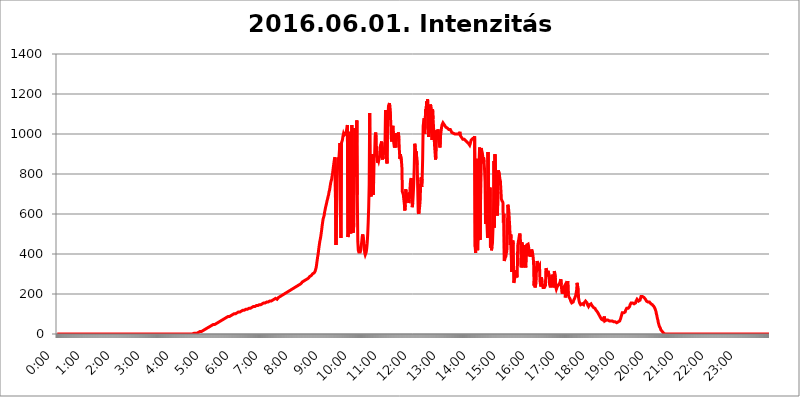
| Category | 2016.06.01. Intenzitás [W/m^2] |
|---|---|
| 0.0 | 0 |
| 0.0006944444444444445 | 0 |
| 0.001388888888888889 | 0 |
| 0.0020833333333333333 | 0 |
| 0.002777777777777778 | 0 |
| 0.003472222222222222 | 0 |
| 0.004166666666666667 | 0 |
| 0.004861111111111111 | 0 |
| 0.005555555555555556 | 0 |
| 0.0062499999999999995 | 0 |
| 0.006944444444444444 | 0 |
| 0.007638888888888889 | 0 |
| 0.008333333333333333 | 0 |
| 0.009027777777777779 | 0 |
| 0.009722222222222222 | 0 |
| 0.010416666666666666 | 0 |
| 0.011111111111111112 | 0 |
| 0.011805555555555555 | 0 |
| 0.012499999999999999 | 0 |
| 0.013194444444444444 | 0 |
| 0.013888888888888888 | 0 |
| 0.014583333333333332 | 0 |
| 0.015277777777777777 | 0 |
| 0.015972222222222224 | 0 |
| 0.016666666666666666 | 0 |
| 0.017361111111111112 | 0 |
| 0.018055555555555557 | 0 |
| 0.01875 | 0 |
| 0.019444444444444445 | 0 |
| 0.02013888888888889 | 0 |
| 0.020833333333333332 | 0 |
| 0.02152777777777778 | 0 |
| 0.022222222222222223 | 0 |
| 0.02291666666666667 | 0 |
| 0.02361111111111111 | 0 |
| 0.024305555555555556 | 0 |
| 0.024999999999999998 | 0 |
| 0.025694444444444447 | 0 |
| 0.02638888888888889 | 0 |
| 0.027083333333333334 | 0 |
| 0.027777777777777776 | 0 |
| 0.02847222222222222 | 0 |
| 0.029166666666666664 | 0 |
| 0.029861111111111113 | 0 |
| 0.030555555555555555 | 0 |
| 0.03125 | 0 |
| 0.03194444444444445 | 0 |
| 0.03263888888888889 | 0 |
| 0.03333333333333333 | 0 |
| 0.034027777777777775 | 0 |
| 0.034722222222222224 | 0 |
| 0.035416666666666666 | 0 |
| 0.036111111111111115 | 0 |
| 0.03680555555555556 | 0 |
| 0.0375 | 0 |
| 0.03819444444444444 | 0 |
| 0.03888888888888889 | 0 |
| 0.03958333333333333 | 0 |
| 0.04027777777777778 | 0 |
| 0.04097222222222222 | 0 |
| 0.041666666666666664 | 0 |
| 0.042361111111111106 | 0 |
| 0.04305555555555556 | 0 |
| 0.043750000000000004 | 0 |
| 0.044444444444444446 | 0 |
| 0.04513888888888889 | 0 |
| 0.04583333333333334 | 0 |
| 0.04652777777777778 | 0 |
| 0.04722222222222222 | 0 |
| 0.04791666666666666 | 0 |
| 0.04861111111111111 | 0 |
| 0.049305555555555554 | 0 |
| 0.049999999999999996 | 0 |
| 0.05069444444444445 | 0 |
| 0.051388888888888894 | 0 |
| 0.052083333333333336 | 0 |
| 0.05277777777777778 | 0 |
| 0.05347222222222222 | 0 |
| 0.05416666666666667 | 0 |
| 0.05486111111111111 | 0 |
| 0.05555555555555555 | 0 |
| 0.05625 | 0 |
| 0.05694444444444444 | 0 |
| 0.057638888888888885 | 0 |
| 0.05833333333333333 | 0 |
| 0.05902777777777778 | 0 |
| 0.059722222222222225 | 0 |
| 0.06041666666666667 | 0 |
| 0.061111111111111116 | 0 |
| 0.06180555555555556 | 0 |
| 0.0625 | 0 |
| 0.06319444444444444 | 0 |
| 0.06388888888888888 | 0 |
| 0.06458333333333334 | 0 |
| 0.06527777777777778 | 0 |
| 0.06597222222222222 | 0 |
| 0.06666666666666667 | 0 |
| 0.06736111111111111 | 0 |
| 0.06805555555555555 | 0 |
| 0.06874999999999999 | 0 |
| 0.06944444444444443 | 0 |
| 0.07013888888888889 | 0 |
| 0.07083333333333333 | 0 |
| 0.07152777777777779 | 0 |
| 0.07222222222222223 | 0 |
| 0.07291666666666667 | 0 |
| 0.07361111111111111 | 0 |
| 0.07430555555555556 | 0 |
| 0.075 | 0 |
| 0.07569444444444444 | 0 |
| 0.0763888888888889 | 0 |
| 0.07708333333333334 | 0 |
| 0.07777777777777778 | 0 |
| 0.07847222222222222 | 0 |
| 0.07916666666666666 | 0 |
| 0.0798611111111111 | 0 |
| 0.08055555555555556 | 0 |
| 0.08125 | 0 |
| 0.08194444444444444 | 0 |
| 0.08263888888888889 | 0 |
| 0.08333333333333333 | 0 |
| 0.08402777777777777 | 0 |
| 0.08472222222222221 | 0 |
| 0.08541666666666665 | 0 |
| 0.08611111111111112 | 0 |
| 0.08680555555555557 | 0 |
| 0.08750000000000001 | 0 |
| 0.08819444444444445 | 0 |
| 0.08888888888888889 | 0 |
| 0.08958333333333333 | 0 |
| 0.09027777777777778 | 0 |
| 0.09097222222222222 | 0 |
| 0.09166666666666667 | 0 |
| 0.09236111111111112 | 0 |
| 0.09305555555555556 | 0 |
| 0.09375 | 0 |
| 0.09444444444444444 | 0 |
| 0.09513888888888888 | 0 |
| 0.09583333333333333 | 0 |
| 0.09652777777777777 | 0 |
| 0.09722222222222222 | 0 |
| 0.09791666666666667 | 0 |
| 0.09861111111111111 | 0 |
| 0.09930555555555555 | 0 |
| 0.09999999999999999 | 0 |
| 0.10069444444444443 | 0 |
| 0.1013888888888889 | 0 |
| 0.10208333333333335 | 0 |
| 0.10277777777777779 | 0 |
| 0.10347222222222223 | 0 |
| 0.10416666666666667 | 0 |
| 0.10486111111111111 | 0 |
| 0.10555555555555556 | 0 |
| 0.10625 | 0 |
| 0.10694444444444444 | 0 |
| 0.1076388888888889 | 0 |
| 0.10833333333333334 | 0 |
| 0.10902777777777778 | 0 |
| 0.10972222222222222 | 0 |
| 0.1111111111111111 | 0 |
| 0.11180555555555556 | 0 |
| 0.11180555555555556 | 0 |
| 0.1125 | 0 |
| 0.11319444444444444 | 0 |
| 0.11388888888888889 | 0 |
| 0.11458333333333333 | 0 |
| 0.11527777777777777 | 0 |
| 0.11597222222222221 | 0 |
| 0.11666666666666665 | 0 |
| 0.1173611111111111 | 0 |
| 0.11805555555555557 | 0 |
| 0.11944444444444445 | 0 |
| 0.12013888888888889 | 0 |
| 0.12083333333333333 | 0 |
| 0.12152777777777778 | 0 |
| 0.12222222222222223 | 0 |
| 0.12291666666666667 | 0 |
| 0.12291666666666667 | 0 |
| 0.12361111111111112 | 0 |
| 0.12430555555555556 | 0 |
| 0.125 | 0 |
| 0.12569444444444444 | 0 |
| 0.12638888888888888 | 0 |
| 0.12708333333333333 | 0 |
| 0.16875 | 0 |
| 0.12847222222222224 | 0 |
| 0.12916666666666668 | 0 |
| 0.12986111111111112 | 0 |
| 0.13055555555555556 | 0 |
| 0.13125 | 0 |
| 0.13194444444444445 | 0 |
| 0.1326388888888889 | 0 |
| 0.13333333333333333 | 0 |
| 0.13402777777777777 | 0 |
| 0.13402777777777777 | 0 |
| 0.13472222222222222 | 0 |
| 0.13541666666666666 | 0 |
| 0.1361111111111111 | 0 |
| 0.13749999999999998 | 0 |
| 0.13819444444444443 | 0 |
| 0.1388888888888889 | 0 |
| 0.13958333333333334 | 0 |
| 0.14027777777777778 | 0 |
| 0.14097222222222222 | 0 |
| 0.14166666666666666 | 0 |
| 0.1423611111111111 | 0 |
| 0.14305555555555557 | 0 |
| 0.14375000000000002 | 0 |
| 0.14444444444444446 | 0 |
| 0.1451388888888889 | 0 |
| 0.1451388888888889 | 0 |
| 0.14652777777777778 | 0 |
| 0.14722222222222223 | 0 |
| 0.14791666666666667 | 0 |
| 0.1486111111111111 | 0 |
| 0.14930555555555555 | 0 |
| 0.15 | 0 |
| 0.15069444444444444 | 0 |
| 0.15138888888888888 | 0 |
| 0.15208333333333332 | 0 |
| 0.15277777777777776 | 0 |
| 0.15347222222222223 | 0 |
| 0.15416666666666667 | 0 |
| 0.15486111111111112 | 0 |
| 0.15555555555555556 | 0 |
| 0.15625 | 0 |
| 0.15694444444444444 | 0 |
| 0.15763888888888888 | 0 |
| 0.15833333333333333 | 0 |
| 0.15902777777777777 | 0 |
| 0.15972222222222224 | 0 |
| 0.16041666666666668 | 0 |
| 0.16111111111111112 | 0 |
| 0.16180555555555556 | 0 |
| 0.1625 | 0 |
| 0.16319444444444445 | 0 |
| 0.1638888888888889 | 0 |
| 0.16458333333333333 | 0 |
| 0.16527777777777777 | 0 |
| 0.16597222222222222 | 0 |
| 0.16666666666666666 | 0 |
| 0.1673611111111111 | 0 |
| 0.16805555555555554 | 0 |
| 0.16874999999999998 | 0 |
| 0.16944444444444443 | 0 |
| 0.17013888888888887 | 0 |
| 0.1708333333333333 | 0 |
| 0.17152777777777775 | 0 |
| 0.17222222222222225 | 0 |
| 0.1729166666666667 | 0 |
| 0.17361111111111113 | 0 |
| 0.17430555555555557 | 0 |
| 0.17500000000000002 | 0 |
| 0.17569444444444446 | 0 |
| 0.1763888888888889 | 0 |
| 0.17708333333333334 | 0 |
| 0.17777777777777778 | 0 |
| 0.17847222222222223 | 0 |
| 0.17916666666666667 | 0 |
| 0.1798611111111111 | 0 |
| 0.18055555555555555 | 0 |
| 0.18125 | 0 |
| 0.18194444444444444 | 0 |
| 0.1826388888888889 | 0 |
| 0.18333333333333335 | 0 |
| 0.1840277777777778 | 0 |
| 0.18472222222222223 | 0 |
| 0.18541666666666667 | 0 |
| 0.18611111111111112 | 0 |
| 0.18680555555555556 | 0 |
| 0.1875 | 0 |
| 0.18819444444444444 | 0 |
| 0.18888888888888888 | 0 |
| 0.18958333333333333 | 0 |
| 0.19027777777777777 | 0 |
| 0.1909722222222222 | 3.525 |
| 0.19166666666666665 | 3.525 |
| 0.19236111111111112 | 3.525 |
| 0.19305555555555554 | 3.525 |
| 0.19375 | 3.525 |
| 0.19444444444444445 | 3.525 |
| 0.1951388888888889 | 3.525 |
| 0.19583333333333333 | 3.525 |
| 0.19652777777777777 | 7.887 |
| 0.19722222222222222 | 7.887 |
| 0.19791666666666666 | 7.887 |
| 0.1986111111111111 | 7.887 |
| 0.19930555555555554 | 12.257 |
| 0.19999999999999998 | 12.257 |
| 0.20069444444444443 | 12.257 |
| 0.20138888888888887 | 12.257 |
| 0.2020833333333333 | 12.257 |
| 0.2027777777777778 | 16.636 |
| 0.2034722222222222 | 16.636 |
| 0.2041666666666667 | 16.636 |
| 0.20486111111111113 | 21.024 |
| 0.20555555555555557 | 21.024 |
| 0.20625000000000002 | 21.024 |
| 0.20694444444444446 | 21.024 |
| 0.2076388888888889 | 21.024 |
| 0.20833333333333334 | 25.419 |
| 0.20902777777777778 | 25.419 |
| 0.20972222222222223 | 29.823 |
| 0.21041666666666667 | 29.823 |
| 0.2111111111111111 | 29.823 |
| 0.21180555555555555 | 29.823 |
| 0.2125 | 34.234 |
| 0.21319444444444444 | 34.234 |
| 0.2138888888888889 | 38.653 |
| 0.21458333333333335 | 38.653 |
| 0.2152777777777778 | 38.653 |
| 0.21597222222222223 | 38.653 |
| 0.21666666666666667 | 43.079 |
| 0.21736111111111112 | 43.079 |
| 0.21805555555555556 | 43.079 |
| 0.21875 | 47.511 |
| 0.21944444444444444 | 47.511 |
| 0.22013888888888888 | 47.511 |
| 0.22083333333333333 | 47.511 |
| 0.22152777777777777 | 47.511 |
| 0.2222222222222222 | 51.951 |
| 0.22291666666666665 | 51.951 |
| 0.2236111111111111 | 51.951 |
| 0.22430555555555556 | 56.398 |
| 0.225 | 56.398 |
| 0.22569444444444445 | 56.398 |
| 0.2263888888888889 | 60.85 |
| 0.22708333333333333 | 60.85 |
| 0.22777777777777777 | 60.85 |
| 0.22847222222222222 | 65.31 |
| 0.22916666666666666 | 65.31 |
| 0.2298611111111111 | 65.31 |
| 0.23055555555555554 | 65.31 |
| 0.23124999999999998 | 69.775 |
| 0.23194444444444443 | 69.775 |
| 0.23263888888888887 | 74.246 |
| 0.2333333333333333 | 74.246 |
| 0.2340277777777778 | 74.246 |
| 0.2347222222222222 | 78.722 |
| 0.2354166666666667 | 78.722 |
| 0.23611111111111113 | 78.722 |
| 0.23680555555555557 | 83.205 |
| 0.23750000000000002 | 83.205 |
| 0.23819444444444446 | 83.205 |
| 0.2388888888888889 | 83.205 |
| 0.23958333333333334 | 87.692 |
| 0.24027777777777778 | 87.692 |
| 0.24097222222222223 | 87.692 |
| 0.24166666666666667 | 87.692 |
| 0.2423611111111111 | 92.184 |
| 0.24305555555555555 | 92.184 |
| 0.24375 | 92.184 |
| 0.24444444444444446 | 92.184 |
| 0.24513888888888888 | 96.682 |
| 0.24583333333333335 | 96.682 |
| 0.2465277777777778 | 96.682 |
| 0.24722222222222223 | 101.184 |
| 0.24791666666666667 | 101.184 |
| 0.24861111111111112 | 101.184 |
| 0.24930555555555556 | 101.184 |
| 0.25 | 101.184 |
| 0.25069444444444444 | 105.69 |
| 0.2513888888888889 | 105.69 |
| 0.2520833333333333 | 105.69 |
| 0.25277777777777777 | 105.69 |
| 0.2534722222222222 | 110.201 |
| 0.25416666666666665 | 110.201 |
| 0.2548611111111111 | 110.201 |
| 0.2555555555555556 | 110.201 |
| 0.25625000000000003 | 110.201 |
| 0.2569444444444445 | 110.201 |
| 0.2576388888888889 | 114.716 |
| 0.25833333333333336 | 114.716 |
| 0.2590277777777778 | 114.716 |
| 0.25972222222222224 | 119.235 |
| 0.2604166666666667 | 119.235 |
| 0.2611111111111111 | 119.235 |
| 0.26180555555555557 | 119.235 |
| 0.2625 | 119.235 |
| 0.26319444444444445 | 123.758 |
| 0.2638888888888889 | 123.758 |
| 0.26458333333333334 | 123.758 |
| 0.2652777777777778 | 123.758 |
| 0.2659722222222222 | 123.758 |
| 0.26666666666666666 | 123.758 |
| 0.2673611111111111 | 128.284 |
| 0.26805555555555555 | 128.284 |
| 0.26875 | 128.284 |
| 0.26944444444444443 | 128.284 |
| 0.2701388888888889 | 128.284 |
| 0.2708333333333333 | 128.284 |
| 0.27152777777777776 | 132.814 |
| 0.2722222222222222 | 132.814 |
| 0.27291666666666664 | 132.814 |
| 0.2736111111111111 | 132.814 |
| 0.2743055555555555 | 132.814 |
| 0.27499999999999997 | 137.347 |
| 0.27569444444444446 | 137.347 |
| 0.27638888888888885 | 137.347 |
| 0.27708333333333335 | 137.347 |
| 0.2777777777777778 | 137.347 |
| 0.27847222222222223 | 141.884 |
| 0.2791666666666667 | 141.884 |
| 0.2798611111111111 | 141.884 |
| 0.28055555555555556 | 141.884 |
| 0.28125 | 141.884 |
| 0.28194444444444444 | 146.423 |
| 0.2826388888888889 | 146.423 |
| 0.2833333333333333 | 146.423 |
| 0.28402777777777777 | 146.423 |
| 0.2847222222222222 | 146.423 |
| 0.28541666666666665 | 146.423 |
| 0.28611111111111115 | 146.423 |
| 0.28680555555555554 | 150.964 |
| 0.28750000000000003 | 150.964 |
| 0.2881944444444445 | 150.964 |
| 0.2888888888888889 | 150.964 |
| 0.28958333333333336 | 155.509 |
| 0.2902777777777778 | 155.509 |
| 0.29097222222222224 | 155.509 |
| 0.2916666666666667 | 155.509 |
| 0.2923611111111111 | 155.509 |
| 0.29305555555555557 | 160.056 |
| 0.29375 | 160.056 |
| 0.29444444444444445 | 160.056 |
| 0.2951388888888889 | 160.056 |
| 0.29583333333333334 | 160.056 |
| 0.2965277777777778 | 164.605 |
| 0.2972222222222222 | 164.605 |
| 0.29791666666666666 | 164.605 |
| 0.2986111111111111 | 164.605 |
| 0.29930555555555555 | 164.605 |
| 0.3 | 164.605 |
| 0.30069444444444443 | 169.156 |
| 0.3013888888888889 | 169.156 |
| 0.3020833333333333 | 169.156 |
| 0.30277777777777776 | 169.156 |
| 0.3034722222222222 | 173.709 |
| 0.30416666666666664 | 173.709 |
| 0.3048611111111111 | 173.709 |
| 0.3055555555555555 | 173.709 |
| 0.30624999999999997 | 178.264 |
| 0.3069444444444444 | 173.709 |
| 0.3076388888888889 | 173.709 |
| 0.30833333333333335 | 173.709 |
| 0.3090277777777778 | 178.264 |
| 0.30972222222222223 | 178.264 |
| 0.3104166666666667 | 182.82 |
| 0.3111111111111111 | 182.82 |
| 0.31180555555555556 | 182.82 |
| 0.3125 | 187.378 |
| 0.31319444444444444 | 187.378 |
| 0.3138888888888889 | 191.937 |
| 0.3145833333333333 | 191.937 |
| 0.31527777777777777 | 191.937 |
| 0.3159722222222222 | 196.497 |
| 0.31666666666666665 | 196.497 |
| 0.31736111111111115 | 196.497 |
| 0.31805555555555554 | 201.058 |
| 0.31875000000000003 | 201.058 |
| 0.3194444444444445 | 201.058 |
| 0.3201388888888889 | 205.62 |
| 0.32083333333333336 | 205.62 |
| 0.3215277777777778 | 205.62 |
| 0.32222222222222224 | 210.182 |
| 0.3229166666666667 | 210.182 |
| 0.3236111111111111 | 214.746 |
| 0.32430555555555557 | 214.746 |
| 0.325 | 214.746 |
| 0.32569444444444445 | 219.309 |
| 0.3263888888888889 | 219.309 |
| 0.32708333333333334 | 219.309 |
| 0.3277777777777778 | 223.873 |
| 0.3284722222222222 | 223.873 |
| 0.32916666666666666 | 223.873 |
| 0.3298611111111111 | 223.873 |
| 0.33055555555555555 | 228.436 |
| 0.33125 | 228.436 |
| 0.33194444444444443 | 233 |
| 0.3326388888888889 | 233 |
| 0.3333333333333333 | 233 |
| 0.3340277777777778 | 233 |
| 0.3347222222222222 | 237.564 |
| 0.3354166666666667 | 237.564 |
| 0.3361111111111111 | 237.564 |
| 0.3368055555555556 | 242.127 |
| 0.33749999999999997 | 242.127 |
| 0.33819444444444446 | 246.689 |
| 0.33888888888888885 | 246.689 |
| 0.33958333333333335 | 246.689 |
| 0.34027777777777773 | 251.251 |
| 0.34097222222222223 | 251.251 |
| 0.3416666666666666 | 251.251 |
| 0.3423611111111111 | 255.813 |
| 0.3430555555555555 | 255.813 |
| 0.34375 | 260.373 |
| 0.3444444444444445 | 260.373 |
| 0.3451388888888889 | 260.373 |
| 0.3458333333333334 | 264.932 |
| 0.34652777777777777 | 264.932 |
| 0.34722222222222227 | 269.49 |
| 0.34791666666666665 | 269.49 |
| 0.34861111111111115 | 269.49 |
| 0.34930555555555554 | 269.49 |
| 0.35000000000000003 | 274.047 |
| 0.3506944444444444 | 274.047 |
| 0.3513888888888889 | 278.603 |
| 0.3520833333333333 | 278.603 |
| 0.3527777777777778 | 283.156 |
| 0.3534722222222222 | 283.156 |
| 0.3541666666666667 | 287.709 |
| 0.3548611111111111 | 287.709 |
| 0.35555555555555557 | 292.259 |
| 0.35625 | 292.259 |
| 0.35694444444444445 | 296.808 |
| 0.3576388888888889 | 296.808 |
| 0.35833333333333334 | 301.354 |
| 0.3590277777777778 | 305.898 |
| 0.3597222222222222 | 305.898 |
| 0.36041666666666666 | 305.898 |
| 0.3611111111111111 | 310.44 |
| 0.36180555555555555 | 314.98 |
| 0.3625 | 324.052 |
| 0.36319444444444443 | 333.113 |
| 0.3638888888888889 | 351.198 |
| 0.3645833333333333 | 369.23 |
| 0.3652777777777778 | 387.202 |
| 0.3659722222222222 | 400.638 |
| 0.3666666666666667 | 422.943 |
| 0.3673611111111111 | 440.702 |
| 0.3680555555555556 | 458.38 |
| 0.36874999999999997 | 471.582 |
| 0.36944444444444446 | 484.735 |
| 0.37013888888888885 | 502.192 |
| 0.37083333333333335 | 519.555 |
| 0.37152777777777773 | 541.121 |
| 0.37222222222222223 | 558.261 |
| 0.3729166666666666 | 575.299 |
| 0.3736111111111111 | 583.779 |
| 0.3743055555555555 | 592.233 |
| 0.375 | 609.062 |
| 0.3756944444444445 | 621.613 |
| 0.3763888888888889 | 634.105 |
| 0.3770833333333334 | 634.105 |
| 0.37777777777777777 | 654.791 |
| 0.37847222222222227 | 667.123 |
| 0.37916666666666665 | 675.311 |
| 0.37986111111111115 | 687.544 |
| 0.38055555555555554 | 695.666 |
| 0.38125000000000003 | 711.832 |
| 0.3819444444444444 | 719.877 |
| 0.3826388888888889 | 735.89 |
| 0.3833333333333333 | 751.803 |
| 0.3840277777777778 | 763.674 |
| 0.3847222222222222 | 771.559 |
| 0.3854166666666667 | 787.258 |
| 0.3861111111111111 | 802.868 |
| 0.38680555555555557 | 822.26 |
| 0.3875 | 841.526 |
| 0.38819444444444445 | 860.676 |
| 0.3888888888888889 | 875.918 |
| 0.38958333333333334 | 883.516 |
| 0.3902777777777778 | 887.309 |
| 0.3909722222222222 | 445.129 |
| 0.39166666666666666 | 600.661 |
| 0.3923611111111111 | 775.492 |
| 0.39305555555555555 | 779.42 |
| 0.39375 | 875.918 |
| 0.39444444444444443 | 879.719 |
| 0.3951388888888889 | 883.516 |
| 0.3958333333333333 | 921.298 |
| 0.3965277777777778 | 955.071 |
| 0.3972222222222222 | 583.779 |
| 0.3979166666666667 | 480.356 |
| 0.3986111111111111 | 955.071 |
| 0.3993055555555556 | 955.071 |
| 0.39999999999999997 | 970.034 |
| 0.40069444444444446 | 988.714 |
| 0.40138888888888885 | 999.916 |
| 0.40208333333333335 | 992.448 |
| 0.40277777777777773 | 992.448 |
| 0.40347222222222223 | 992.448 |
| 0.4041666666666666 | 999.916 |
| 0.4048611111111111 | 1007.383 |
| 0.4055555555555555 | 1014.852 |
| 0.40625 | 1029.798 |
| 0.4069444444444445 | 1044.762 |
| 0.4076388888888889 | 484.735 |
| 0.4083333333333334 | 497.836 |
| 0.40902777777777777 | 541.121 |
| 0.40972222222222227 | 951.327 |
| 0.41041666666666665 | 1011.118 |
| 0.41111111111111115 | 515.223 |
| 0.41180555555555554 | 502.192 |
| 0.41250000000000003 | 613.252 |
| 0.4131944444444444 | 1044.762 |
| 0.4138888888888889 | 646.537 |
| 0.4145833333333333 | 519.555 |
| 0.4152777777777778 | 506.542 |
| 0.4159722222222222 | 553.986 |
| 0.4166666666666667 | 783.342 |
| 0.4173611111111111 | 1029.798 |
| 0.41805555555555557 | 787.258 |
| 0.41875 | 928.819 |
| 0.41944444444444445 | 868.305 |
| 0.4201388888888889 | 1067.267 |
| 0.42083333333333334 | 695.666 |
| 0.4215277777777778 | 462.786 |
| 0.4222222222222222 | 418.492 |
| 0.42291666666666666 | 409.574 |
| 0.4236111111111111 | 409.574 |
| 0.42430555555555555 | 409.574 |
| 0.425 | 409.574 |
| 0.42569444444444443 | 418.492 |
| 0.4263888888888889 | 440.702 |
| 0.4270833333333333 | 462.786 |
| 0.4277777777777778 | 489.108 |
| 0.4284722222222222 | 497.836 |
| 0.4291666666666667 | 502.192 |
| 0.4298611111111111 | 462.786 |
| 0.4305555555555556 | 431.833 |
| 0.43124999999999997 | 405.108 |
| 0.43194444444444446 | 396.164 |
| 0.43263888888888885 | 396.164 |
| 0.43333333333333335 | 409.574 |
| 0.43402777777777773 | 427.39 |
| 0.43472222222222223 | 453.968 |
| 0.4354166666666666 | 497.836 |
| 0.4361111111111111 | 558.261 |
| 0.4368055555555555 | 634.105 |
| 0.4375 | 747.834 |
| 0.4381944444444445 | 1105.019 |
| 0.4388888888888889 | 767.62 |
| 0.4395833333333334 | 695.666 |
| 0.44027777777777777 | 687.544 |
| 0.44097222222222227 | 822.26 |
| 0.44166666666666665 | 779.42 |
| 0.44236111111111115 | 898.668 |
| 0.44305555555555554 | 695.666 |
| 0.44375000000000003 | 759.723 |
| 0.4444444444444444 | 879.719 |
| 0.4451388888888889 | 894.885 |
| 0.4458333333333333 | 988.714 |
| 0.4465277777777778 | 1007.383 |
| 0.4472222222222222 | 981.244 |
| 0.4479166666666667 | 902.447 |
| 0.4486111111111111 | 898.668 |
| 0.44930555555555557 | 856.855 |
| 0.45 | 872.114 |
| 0.45069444444444445 | 864.493 |
| 0.4513888888888889 | 868.305 |
| 0.45208333333333334 | 887.309 |
| 0.4527777777777778 | 932.576 |
| 0.4534722222222222 | 943.832 |
| 0.45416666666666666 | 951.327 |
| 0.4548611111111111 | 962.555 |
| 0.45555555555555555 | 917.534 |
| 0.45625 | 872.114 |
| 0.45694444444444443 | 909.996 |
| 0.4576388888888889 | 898.668 |
| 0.4583333333333333 | 909.996 |
| 0.4590277777777778 | 902.447 |
| 0.4597222222222222 | 958.814 |
| 0.4604166666666667 | 1120.238 |
| 0.4611111111111111 | 875.918 |
| 0.4618055555555556 | 891.099 |
| 0.46249999999999997 | 853.029 |
| 0.46319444444444446 | 1041.019 |
| 0.46388888888888885 | 1089.873 |
| 0.46458333333333335 | 1139.384 |
| 0.46527777777777773 | 1143.232 |
| 0.46597222222222223 | 1154.814 |
| 0.4666666666666666 | 1150.946 |
| 0.4673611111111111 | 1089.873 |
| 0.4680555555555555 | 1026.06 |
| 0.46875 | 962.555 |
| 0.4694444444444445 | 1007.383 |
| 0.4701388888888889 | 1033.537 |
| 0.4708333333333334 | 1041.019 |
| 0.47152777777777777 | 966.295 |
| 0.47222222222222227 | 962.555 |
| 0.47291666666666665 | 932.576 |
| 0.47361111111111115 | 1003.65 |
| 0.47430555555555554 | 947.58 |
| 0.47500000000000003 | 932.576 |
| 0.4756944444444444 | 1003.65 |
| 0.4763888888888889 | 996.182 |
| 0.4770833333333333 | 999.916 |
| 0.4777777777777778 | 981.244 |
| 0.4784722222222222 | 1007.383 |
| 0.4791666666666667 | 973.772 |
| 0.4798611111111111 | 917.534 |
| 0.48055555555555557 | 875.918 |
| 0.48125 | 898.668 |
| 0.48194444444444445 | 902.447 |
| 0.4826388888888889 | 868.305 |
| 0.48333333333333334 | 837.682 |
| 0.4840277777777778 | 711.832 |
| 0.4847222222222222 | 711.832 |
| 0.48541666666666666 | 695.666 |
| 0.4861111111111111 | 671.22 |
| 0.48680555555555555 | 650.667 |
| 0.4875 | 617.436 |
| 0.48819444444444443 | 646.537 |
| 0.4888888888888889 | 723.889 |
| 0.4895833333333333 | 687.544 |
| 0.4902777777777778 | 687.544 |
| 0.4909722222222222 | 683.473 |
| 0.4916666666666667 | 695.666 |
| 0.4923611111111111 | 683.473 |
| 0.4930555555555556 | 654.791 |
| 0.49374999999999997 | 671.22 |
| 0.49444444444444446 | 699.717 |
| 0.49513888888888885 | 751.803 |
| 0.49583333333333335 | 771.559 |
| 0.49652777777777773 | 779.42 |
| 0.49722222222222223 | 699.717 |
| 0.4979166666666666 | 634.105 |
| 0.4986111111111111 | 654.791 |
| 0.4993055555555555 | 699.717 |
| 0.5 | 751.803 |
| 0.5006944444444444 | 833.834 |
| 0.5013888888888889 | 951.327 |
| 0.5020833333333333 | 936.33 |
| 0.5027777777777778 | 906.223 |
| 0.5034722222222222 | 913.766 |
| 0.5041666666666667 | 909.996 |
| 0.5048611111111111 | 845.365 |
| 0.5055555555555555 | 727.896 |
| 0.50625 | 609.062 |
| 0.5069444444444444 | 600.661 |
| 0.5076388888888889 | 613.252 |
| 0.5083333333333333 | 638.256 |
| 0.5090277777777777 | 671.22 |
| 0.5097222222222222 | 759.723 |
| 0.5104166666666666 | 783.342 |
| 0.5111111111111112 | 735.89 |
| 0.5118055555555555 | 775.492 |
| 0.5125000000000001 | 875.918 |
| 0.5131944444444444 | 1041.019 |
| 0.513888888888889 | 1041.019 |
| 0.5145833333333333 | 1078.555 |
| 0.5152777777777778 | 999.916 |
| 0.5159722222222222 | 1059.756 |
| 0.5166666666666667 | 1124.056 |
| 0.517361111111111 | 1112.618 |
| 0.5180555555555556 | 1162.571 |
| 0.5187499999999999 | 1112.618 |
| 0.5194444444444445 | 1174.263 |
| 0.5201388888888888 | 1022.323 |
| 0.5208333333333334 | 984.98 |
| 0.5215277777777778 | 1139.384 |
| 0.5222222222222223 | 1086.097 |
| 0.5229166666666667 | 1037.277 |
| 0.5236111111111111 | 1147.086 |
| 0.5243055555555556 | 1124.056 |
| 0.525 | 1007.383 |
| 0.5256944444444445 | 970.034 |
| 0.5263888888888889 | 1124.056 |
| 0.5270833333333333 | 1074.789 |
| 0.5277777777777778 | 1033.537 |
| 0.5284722222222222 | 992.448 |
| 0.5291666666666667 | 943.832 |
| 0.5298611111111111 | 909.996 |
| 0.5305555555555556 | 872.114 |
| 0.53125 | 887.309 |
| 0.5319444444444444 | 1018.587 |
| 0.5326388888888889 | 999.916 |
| 0.5333333333333333 | 970.034 |
| 0.5340277777777778 | 1022.323 |
| 0.5347222222222222 | 973.772 |
| 0.5354166666666667 | 958.814 |
| 0.5361111111111111 | 947.58 |
| 0.5368055555555555 | 932.576 |
| 0.5375 | 988.714 |
| 0.5381944444444444 | 984.98 |
| 0.5388888888888889 | 1029.798 |
| 0.5395833333333333 | 1044.762 |
| 0.5402777777777777 | 1048.508 |
| 0.5409722222222222 | 1056.004 |
| 0.5416666666666666 | 1056.004 |
| 0.5423611111111112 | 1052.255 |
| 0.5430555555555555 | 1044.762 |
| 0.5437500000000001 | 1044.762 |
| 0.5444444444444444 | 1041.019 |
| 0.545138888888889 | 1033.537 |
| 0.5458333333333333 | 1033.537 |
| 0.5465277777777778 | 1029.798 |
| 0.5472222222222222 | 1029.798 |
| 0.5479166666666667 | 1029.798 |
| 0.548611111111111 | 1026.06 |
| 0.5493055555555556 | 1022.323 |
| 0.5499999999999999 | 1018.587 |
| 0.5506944444444445 | 1022.323 |
| 0.5513888888888888 | 1022.323 |
| 0.5520833333333334 | 1026.06 |
| 0.5527777777777778 | 1018.587 |
| 0.5534722222222223 | 1007.383 |
| 0.5541666666666667 | 1007.383 |
| 0.5548611111111111 | 1007.383 |
| 0.5555555555555556 | 1003.65 |
| 0.55625 | 1003.65 |
| 0.5569444444444445 | 999.916 |
| 0.5576388888888889 | 999.916 |
| 0.5583333333333333 | 999.916 |
| 0.5590277777777778 | 999.916 |
| 0.5597222222222222 | 999.916 |
| 0.5604166666666667 | 999.916 |
| 0.5611111111111111 | 999.916 |
| 0.5618055555555556 | 999.916 |
| 0.5625 | 999.916 |
| 0.5631944444444444 | 999.916 |
| 0.5638888888888889 | 1003.65 |
| 0.5645833333333333 | 1011.118 |
| 0.5652777777777778 | 992.448 |
| 0.5659722222222222 | 992.448 |
| 0.5666666666666667 | 988.714 |
| 0.5673611111111111 | 981.244 |
| 0.5680555555555555 | 977.508 |
| 0.56875 | 973.772 |
| 0.5694444444444444 | 970.034 |
| 0.5701388888888889 | 973.772 |
| 0.5708333333333333 | 973.772 |
| 0.5715277777777777 | 973.772 |
| 0.5722222222222222 | 970.034 |
| 0.5729166666666666 | 966.295 |
| 0.5736111111111112 | 962.555 |
| 0.5743055555555555 | 962.555 |
| 0.5750000000000001 | 958.814 |
| 0.5756944444444444 | 955.071 |
| 0.576388888888889 | 955.071 |
| 0.5770833333333333 | 951.327 |
| 0.5777777777777778 | 947.58 |
| 0.5784722222222222 | 943.832 |
| 0.5791666666666667 | 951.327 |
| 0.579861111111111 | 955.071 |
| 0.5805555555555556 | 970.034 |
| 0.5812499999999999 | 973.772 |
| 0.5819444444444445 | 973.772 |
| 0.5826388888888888 | 977.508 |
| 0.5833333333333334 | 981.244 |
| 0.5840277777777778 | 977.508 |
| 0.5847222222222223 | 981.244 |
| 0.5854166666666667 | 988.714 |
| 0.5861111111111111 | 436.27 |
| 0.5868055555555556 | 405.108 |
| 0.5875 | 856.855 |
| 0.5881944444444445 | 875.918 |
| 0.5888888888888889 | 523.88 |
| 0.5895833333333333 | 418.492 |
| 0.5902777777777778 | 506.542 |
| 0.5909722222222222 | 791.169 |
| 0.5916666666666667 | 868.305 |
| 0.5923611111111111 | 932.576 |
| 0.5930555555555556 | 471.582 |
| 0.59375 | 475.972 |
| 0.5944444444444444 | 928.819 |
| 0.5951388888888889 | 921.298 |
| 0.5958333333333333 | 925.06 |
| 0.5965277777777778 | 898.668 |
| 0.5972222222222222 | 853.029 |
| 0.5979166666666667 | 883.516 |
| 0.5986111111111111 | 860.676 |
| 0.5993055555555555 | 822.26 |
| 0.6 | 763.674 |
| 0.6006944444444444 | 549.704 |
| 0.6013888888888889 | 711.832 |
| 0.6020833333333333 | 583.779 |
| 0.6027777777777777 | 545.416 |
| 0.6034722222222222 | 480.356 |
| 0.6041666666666666 | 909.996 |
| 0.6048611111111112 | 913.766 |
| 0.6055555555555555 | 523.88 |
| 0.6062500000000001 | 484.735 |
| 0.6069444444444444 | 731.896 |
| 0.607638888888889 | 431.833 |
| 0.6083333333333333 | 475.972 |
| 0.6090277777777778 | 418.492 |
| 0.6097222222222222 | 436.27 |
| 0.6104166666666667 | 453.968 |
| 0.611111111111111 | 453.968 |
| 0.6118055555555556 | 596.45 |
| 0.6124999999999999 | 864.493 |
| 0.6131944444444445 | 532.513 |
| 0.6138888888888888 | 898.668 |
| 0.6145833333333334 | 894.885 |
| 0.6152777777777778 | 902.447 |
| 0.6159722222222223 | 695.666 |
| 0.6166666666666667 | 625.784 |
| 0.6173611111111111 | 592.233 |
| 0.6180555555555556 | 711.832 |
| 0.61875 | 818.392 |
| 0.6194444444444445 | 814.519 |
| 0.6201388888888889 | 795.074 |
| 0.6208333333333333 | 775.492 |
| 0.6215277777777778 | 763.674 |
| 0.6222222222222222 | 763.674 |
| 0.6229166666666667 | 675.311 |
| 0.6236111111111111 | 667.123 |
| 0.6243055555555556 | 663.019 |
| 0.625 | 658.909 |
| 0.6256944444444444 | 558.261 |
| 0.6263888888888889 | 600.661 |
| 0.6270833333333333 | 364.728 |
| 0.6277777777777778 | 378.224 |
| 0.6284722222222222 | 378.224 |
| 0.6291666666666667 | 387.202 |
| 0.6298611111111111 | 405.108 |
| 0.6305555555555555 | 414.035 |
| 0.63125 | 480.356 |
| 0.6319444444444444 | 646.537 |
| 0.6326388888888889 | 634.105 |
| 0.6333333333333333 | 617.436 |
| 0.6340277777777777 | 571.049 |
| 0.6347222222222222 | 528.2 |
| 0.6354166666666666 | 445.129 |
| 0.6361111111111112 | 497.836 |
| 0.6368055555555555 | 497.836 |
| 0.6375000000000001 | 310.44 |
| 0.6381944444444444 | 378.224 |
| 0.638888888888889 | 467.187 |
| 0.6395833333333333 | 449.551 |
| 0.6402777777777778 | 255.813 |
| 0.6409722222222222 | 264.932 |
| 0.6416666666666667 | 278.603 |
| 0.642361111111111 | 287.709 |
| 0.6430555555555556 | 287.709 |
| 0.6437499999999999 | 319.517 |
| 0.6444444444444445 | 283.156 |
| 0.6451388888888888 | 296.808 |
| 0.6458333333333334 | 440.702 |
| 0.6465277777777778 | 458.38 |
| 0.6472222222222223 | 471.582 |
| 0.6479166666666667 | 489.108 |
| 0.6486111111111111 | 502.192 |
| 0.6493055555555556 | 489.108 |
| 0.65 | 440.702 |
| 0.6506944444444445 | 333.113 |
| 0.6513888888888889 | 458.38 |
| 0.6520833333333333 | 453.968 |
| 0.6527777777777778 | 440.702 |
| 0.6534722222222222 | 333.113 |
| 0.6541666666666667 | 440.702 |
| 0.6548611111111111 | 431.833 |
| 0.6555555555555556 | 414.035 |
| 0.65625 | 445.129 |
| 0.6569444444444444 | 333.113 |
| 0.6576388888888889 | 333.113 |
| 0.6583333333333333 | 445.129 |
| 0.6590277777777778 | 445.129 |
| 0.6597222222222222 | 449.551 |
| 0.6604166666666667 | 449.551 |
| 0.6611111111111111 | 436.27 |
| 0.6618055555555555 | 391.685 |
| 0.6625 | 405.108 |
| 0.6631944444444444 | 387.202 |
| 0.6638888888888889 | 387.202 |
| 0.6645833333333333 | 400.638 |
| 0.6652777777777777 | 422.943 |
| 0.6659722222222222 | 422.943 |
| 0.6666666666666666 | 405.108 |
| 0.6673611111111111 | 387.202 |
| 0.6680555555555556 | 360.221 |
| 0.6687500000000001 | 242.127 |
| 0.6694444444444444 | 278.603 |
| 0.6701388888888888 | 233 |
| 0.6708333333333334 | 242.127 |
| 0.6715277777777778 | 255.813 |
| 0.6722222222222222 | 333.113 |
| 0.6729166666666666 | 364.728 |
| 0.6736111111111112 | 355.712 |
| 0.6743055555555556 | 342.162 |
| 0.6749999999999999 | 333.113 |
| 0.6756944444444444 | 333.113 |
| 0.6763888888888889 | 342.162 |
| 0.6770833333333334 | 264.932 |
| 0.6777777777777777 | 246.689 |
| 0.6784722222222223 | 237.564 |
| 0.6791666666666667 | 283.156 |
| 0.6798611111111111 | 260.373 |
| 0.6805555555555555 | 264.932 |
| 0.68125 | 233 |
| 0.6819444444444445 | 233 |
| 0.6826388888888889 | 233 |
| 0.6833333333333332 | 233 |
| 0.6840277777777778 | 237.564 |
| 0.6847222222222222 | 242.127 |
| 0.6854166666666667 | 328.584 |
| 0.686111111111111 | 333.113 |
| 0.6868055555555556 | 314.98 |
| 0.6875 | 287.709 |
| 0.6881944444444444 | 314.98 |
| 0.688888888888889 | 319.517 |
| 0.6895833333333333 | 296.808 |
| 0.6902777777777778 | 251.251 |
| 0.6909722222222222 | 242.127 |
| 0.6916666666666668 | 233 |
| 0.6923611111111111 | 233 |
| 0.6930555555555555 | 278.603 |
| 0.69375 | 296.808 |
| 0.6944444444444445 | 287.709 |
| 0.6951388888888889 | 292.259 |
| 0.6958333333333333 | 233 |
| 0.6965277777777777 | 274.047 |
| 0.6972222222222223 | 314.98 |
| 0.6979166666666666 | 310.44 |
| 0.6986111111111111 | 283.156 |
| 0.6993055555555556 | 233 |
| 0.7000000000000001 | 223.873 |
| 0.7006944444444444 | 228.436 |
| 0.7013888888888888 | 237.564 |
| 0.7020833333333334 | 242.127 |
| 0.7027777777777778 | 242.127 |
| 0.7034722222222222 | 246.689 |
| 0.7041666666666666 | 251.251 |
| 0.7048611111111112 | 255.813 |
| 0.7055555555555556 | 251.251 |
| 0.7062499999999999 | 274.047 |
| 0.7069444444444444 | 246.689 |
| 0.7076388888888889 | 214.746 |
| 0.7083333333333334 | 201.058 |
| 0.7090277777777777 | 196.497 |
| 0.7097222222222223 | 196.497 |
| 0.7104166666666667 | 233 |
| 0.7111111111111111 | 237.564 |
| 0.7118055555555555 | 242.127 |
| 0.7125 | 182.82 |
| 0.7131944444444445 | 196.497 |
| 0.7138888888888889 | 233 |
| 0.7145833333333332 | 210.182 |
| 0.7152777777777778 | 242.127 |
| 0.7159722222222222 | 264.932 |
| 0.7166666666666667 | 201.058 |
| 0.717361111111111 | 187.378 |
| 0.7180555555555556 | 182.82 |
| 0.71875 | 182.82 |
| 0.7194444444444444 | 173.709 |
| 0.720138888888889 | 164.605 |
| 0.7208333333333333 | 160.056 |
| 0.7215277777777778 | 155.509 |
| 0.7222222222222222 | 155.509 |
| 0.7229166666666668 | 155.509 |
| 0.7236111111111111 | 160.056 |
| 0.7243055555555555 | 169.156 |
| 0.725 | 173.709 |
| 0.7256944444444445 | 178.264 |
| 0.7263888888888889 | 182.82 |
| 0.7270833333333333 | 191.937 |
| 0.7277777777777777 | 205.62 |
| 0.7284722222222223 | 219.309 |
| 0.7291666666666666 | 255.813 |
| 0.7298611111111111 | 251.251 |
| 0.7305555555555556 | 219.309 |
| 0.7312500000000001 | 178.264 |
| 0.7319444444444444 | 164.605 |
| 0.7326388888888888 | 155.509 |
| 0.7333333333333334 | 150.964 |
| 0.7340277777777778 | 146.423 |
| 0.7347222222222222 | 146.423 |
| 0.7354166666666666 | 146.423 |
| 0.7361111111111112 | 150.964 |
| 0.7368055555555556 | 146.423 |
| 0.7374999999999999 | 146.423 |
| 0.7381944444444444 | 146.423 |
| 0.7388888888888889 | 155.509 |
| 0.7395833333333334 | 160.056 |
| 0.7402777777777777 | 160.056 |
| 0.7409722222222223 | 164.605 |
| 0.7416666666666667 | 164.605 |
| 0.7423611111111111 | 160.056 |
| 0.7430555555555555 | 155.509 |
| 0.74375 | 146.423 |
| 0.7444444444444445 | 141.884 |
| 0.7451388888888889 | 137.347 |
| 0.7458333333333332 | 141.884 |
| 0.7465277777777778 | 146.423 |
| 0.7472222222222222 | 146.423 |
| 0.7479166666666667 | 150.964 |
| 0.748611111111111 | 150.964 |
| 0.7493055555555556 | 146.423 |
| 0.75 | 141.884 |
| 0.7506944444444444 | 137.347 |
| 0.751388888888889 | 137.347 |
| 0.7520833333333333 | 132.814 |
| 0.7527777777777778 | 132.814 |
| 0.7534722222222222 | 128.284 |
| 0.7541666666666668 | 128.284 |
| 0.7548611111111111 | 123.758 |
| 0.7555555555555555 | 119.235 |
| 0.75625 | 119.235 |
| 0.7569444444444445 | 114.716 |
| 0.7576388888888889 | 110.201 |
| 0.7583333333333333 | 110.201 |
| 0.7590277777777777 | 101.184 |
| 0.7597222222222223 | 96.682 |
| 0.7604166666666666 | 92.184 |
| 0.7611111111111111 | 87.692 |
| 0.7618055555555556 | 83.205 |
| 0.7625000000000001 | 78.722 |
| 0.7631944444444444 | 74.246 |
| 0.7638888888888888 | 74.246 |
| 0.7645833333333334 | 69.775 |
| 0.7652777777777778 | 69.775 |
| 0.7659722222222222 | 69.775 |
| 0.7666666666666666 | 69.775 |
| 0.7673611111111112 | 87.692 |
| 0.7680555555555556 | 65.31 |
| 0.7687499999999999 | 65.31 |
| 0.7694444444444444 | 65.31 |
| 0.7701388888888889 | 69.775 |
| 0.7708333333333334 | 69.775 |
| 0.7715277777777777 | 69.775 |
| 0.7722222222222223 | 69.775 |
| 0.7729166666666667 | 69.775 |
| 0.7736111111111111 | 69.775 |
| 0.7743055555555555 | 65.31 |
| 0.775 | 65.31 |
| 0.7756944444444445 | 65.31 |
| 0.7763888888888889 | 65.31 |
| 0.7770833333333332 | 65.31 |
| 0.7777777777777778 | 65.31 |
| 0.7784722222222222 | 65.31 |
| 0.7791666666666667 | 65.31 |
| 0.779861111111111 | 65.31 |
| 0.7805555555555556 | 60.85 |
| 0.78125 | 60.85 |
| 0.7819444444444444 | 60.85 |
| 0.782638888888889 | 60.85 |
| 0.7833333333333333 | 56.398 |
| 0.7840277777777778 | 56.398 |
| 0.7847222222222222 | 56.398 |
| 0.7854166666666668 | 56.398 |
| 0.7861111111111111 | 56.398 |
| 0.7868055555555555 | 60.85 |
| 0.7875 | 60.85 |
| 0.7881944444444445 | 65.31 |
| 0.7888888888888889 | 65.31 |
| 0.7895833333333333 | 69.775 |
| 0.7902777777777777 | 78.722 |
| 0.7909722222222223 | 87.692 |
| 0.7916666666666666 | 96.682 |
| 0.7923611111111111 | 105.69 |
| 0.7930555555555556 | 110.201 |
| 0.7937500000000001 | 110.201 |
| 0.7944444444444444 | 105.69 |
| 0.7951388888888888 | 101.184 |
| 0.7958333333333334 | 101.184 |
| 0.7965277777777778 | 110.201 |
| 0.7972222222222222 | 119.235 |
| 0.7979166666666666 | 123.758 |
| 0.7986111111111112 | 128.284 |
| 0.7993055555555556 | 128.284 |
| 0.7999999999999999 | 128.284 |
| 0.8006944444444444 | 128.284 |
| 0.8013888888888889 | 128.284 |
| 0.8020833333333334 | 132.814 |
| 0.8027777777777777 | 137.347 |
| 0.8034722222222223 | 146.423 |
| 0.8041666666666667 | 150.964 |
| 0.8048611111111111 | 155.509 |
| 0.8055555555555555 | 155.509 |
| 0.80625 | 155.509 |
| 0.8069444444444445 | 155.509 |
| 0.8076388888888889 | 155.509 |
| 0.8083333333333332 | 150.964 |
| 0.8090277777777778 | 150.964 |
| 0.8097222222222222 | 150.964 |
| 0.8104166666666667 | 150.964 |
| 0.811111111111111 | 155.509 |
| 0.8118055555555556 | 164.605 |
| 0.8125 | 169.156 |
| 0.8131944444444444 | 173.709 |
| 0.813888888888889 | 173.709 |
| 0.8145833333333333 | 173.709 |
| 0.8152777777777778 | 164.605 |
| 0.8159722222222222 | 164.605 |
| 0.8166666666666668 | 164.605 |
| 0.8173611111111111 | 169.156 |
| 0.8180555555555555 | 178.264 |
| 0.81875 | 187.378 |
| 0.8194444444444445 | 191.937 |
| 0.8201388888888889 | 191.937 |
| 0.8208333333333333 | 187.378 |
| 0.8215277777777777 | 187.378 |
| 0.8222222222222223 | 182.82 |
| 0.8229166666666666 | 182.82 |
| 0.8236111111111111 | 182.82 |
| 0.8243055555555556 | 178.264 |
| 0.8250000000000001 | 173.709 |
| 0.8256944444444444 | 169.156 |
| 0.8263888888888888 | 164.605 |
| 0.8270833333333334 | 164.605 |
| 0.8277777777777778 | 160.056 |
| 0.8284722222222222 | 160.056 |
| 0.8291666666666666 | 160.056 |
| 0.8298611111111112 | 160.056 |
| 0.8305555555555556 | 160.056 |
| 0.8312499999999999 | 160.056 |
| 0.8319444444444444 | 155.509 |
| 0.8326388888888889 | 150.964 |
| 0.8333333333333334 | 150.964 |
| 0.8340277777777777 | 146.423 |
| 0.8347222222222223 | 146.423 |
| 0.8354166666666667 | 146.423 |
| 0.8361111111111111 | 141.884 |
| 0.8368055555555555 | 137.347 |
| 0.8375 | 132.814 |
| 0.8381944444444445 | 128.284 |
| 0.8388888888888889 | 123.758 |
| 0.8395833333333332 | 114.716 |
| 0.8402777777777778 | 101.184 |
| 0.8409722222222222 | 92.184 |
| 0.8416666666666667 | 78.722 |
| 0.842361111111111 | 69.775 |
| 0.8430555555555556 | 56.398 |
| 0.84375 | 47.511 |
| 0.8444444444444444 | 38.653 |
| 0.845138888888889 | 34.234 |
| 0.8458333333333333 | 29.823 |
| 0.8465277777777778 | 21.024 |
| 0.8472222222222222 | 16.636 |
| 0.8479166666666668 | 16.636 |
| 0.8486111111111111 | 12.257 |
| 0.8493055555555555 | 7.887 |
| 0.85 | 7.887 |
| 0.8506944444444445 | 3.525 |
| 0.8513888888888889 | 0 |
| 0.8520833333333333 | 0 |
| 0.8527777777777777 | 0 |
| 0.8534722222222223 | 0 |
| 0.8541666666666666 | 0 |
| 0.8548611111111111 | 0 |
| 0.8555555555555556 | 0 |
| 0.8562500000000001 | 0 |
| 0.8569444444444444 | 0 |
| 0.8576388888888888 | 0 |
| 0.8583333333333334 | 0 |
| 0.8590277777777778 | 0 |
| 0.8597222222222222 | 0 |
| 0.8604166666666666 | 0 |
| 0.8611111111111112 | 0 |
| 0.8618055555555556 | 0 |
| 0.8624999999999999 | 0 |
| 0.8631944444444444 | 0 |
| 0.8638888888888889 | 0 |
| 0.8645833333333334 | 0 |
| 0.8652777777777777 | 0 |
| 0.8659722222222223 | 0 |
| 0.8666666666666667 | 0 |
| 0.8673611111111111 | 0 |
| 0.8680555555555555 | 0 |
| 0.86875 | 0 |
| 0.8694444444444445 | 0 |
| 0.8701388888888889 | 0 |
| 0.8708333333333332 | 0 |
| 0.8715277777777778 | 0 |
| 0.8722222222222222 | 0 |
| 0.8729166666666667 | 0 |
| 0.873611111111111 | 0 |
| 0.8743055555555556 | 0 |
| 0.875 | 0 |
| 0.8756944444444444 | 0 |
| 0.876388888888889 | 0 |
| 0.8770833333333333 | 0 |
| 0.8777777777777778 | 0 |
| 0.8784722222222222 | 0 |
| 0.8791666666666668 | 0 |
| 0.8798611111111111 | 0 |
| 0.8805555555555555 | 0 |
| 0.88125 | 0 |
| 0.8819444444444445 | 0 |
| 0.8826388888888889 | 0 |
| 0.8833333333333333 | 0 |
| 0.8840277777777777 | 0 |
| 0.8847222222222223 | 0 |
| 0.8854166666666666 | 0 |
| 0.8861111111111111 | 0 |
| 0.8868055555555556 | 0 |
| 0.8875000000000001 | 0 |
| 0.8881944444444444 | 0 |
| 0.8888888888888888 | 0 |
| 0.8895833333333334 | 0 |
| 0.8902777777777778 | 0 |
| 0.8909722222222222 | 0 |
| 0.8916666666666666 | 0 |
| 0.8923611111111112 | 0 |
| 0.8930555555555556 | 0 |
| 0.8937499999999999 | 0 |
| 0.8944444444444444 | 0 |
| 0.8951388888888889 | 0 |
| 0.8958333333333334 | 0 |
| 0.8965277777777777 | 0 |
| 0.8972222222222223 | 0 |
| 0.8979166666666667 | 0 |
| 0.8986111111111111 | 0 |
| 0.8993055555555555 | 0 |
| 0.9 | 0 |
| 0.9006944444444445 | 0 |
| 0.9013888888888889 | 0 |
| 0.9020833333333332 | 0 |
| 0.9027777777777778 | 0 |
| 0.9034722222222222 | 0 |
| 0.9041666666666667 | 0 |
| 0.904861111111111 | 0 |
| 0.9055555555555556 | 0 |
| 0.90625 | 0 |
| 0.9069444444444444 | 0 |
| 0.907638888888889 | 0 |
| 0.9083333333333333 | 0 |
| 0.9090277777777778 | 0 |
| 0.9097222222222222 | 0 |
| 0.9104166666666668 | 0 |
| 0.9111111111111111 | 0 |
| 0.9118055555555555 | 0 |
| 0.9125 | 0 |
| 0.9131944444444445 | 0 |
| 0.9138888888888889 | 0 |
| 0.9145833333333333 | 0 |
| 0.9152777777777777 | 0 |
| 0.9159722222222223 | 0 |
| 0.9166666666666666 | 0 |
| 0.9173611111111111 | 0 |
| 0.9180555555555556 | 0 |
| 0.9187500000000001 | 0 |
| 0.9194444444444444 | 0 |
| 0.9201388888888888 | 0 |
| 0.9208333333333334 | 0 |
| 0.9215277777777778 | 0 |
| 0.9222222222222222 | 0 |
| 0.9229166666666666 | 0 |
| 0.9236111111111112 | 0 |
| 0.9243055555555556 | 0 |
| 0.9249999999999999 | 0 |
| 0.9256944444444444 | 0 |
| 0.9263888888888889 | 0 |
| 0.9270833333333334 | 0 |
| 0.9277777777777777 | 0 |
| 0.9284722222222223 | 0 |
| 0.9291666666666667 | 0 |
| 0.9298611111111111 | 0 |
| 0.9305555555555555 | 0 |
| 0.93125 | 0 |
| 0.9319444444444445 | 0 |
| 0.9326388888888889 | 0 |
| 0.9333333333333332 | 0 |
| 0.9340277777777778 | 0 |
| 0.9347222222222222 | 0 |
| 0.9354166666666667 | 0 |
| 0.936111111111111 | 0 |
| 0.9368055555555556 | 0 |
| 0.9375 | 0 |
| 0.9381944444444444 | 0 |
| 0.938888888888889 | 0 |
| 0.9395833333333333 | 0 |
| 0.9402777777777778 | 0 |
| 0.9409722222222222 | 0 |
| 0.9416666666666668 | 0 |
| 0.9423611111111111 | 0 |
| 0.9430555555555555 | 0 |
| 0.94375 | 0 |
| 0.9444444444444445 | 0 |
| 0.9451388888888889 | 0 |
| 0.9458333333333333 | 0 |
| 0.9465277777777777 | 0 |
| 0.9472222222222223 | 0 |
| 0.9479166666666666 | 0 |
| 0.9486111111111111 | 0 |
| 0.9493055555555556 | 0 |
| 0.9500000000000001 | 0 |
| 0.9506944444444444 | 0 |
| 0.9513888888888888 | 0 |
| 0.9520833333333334 | 0 |
| 0.9527777777777778 | 0 |
| 0.9534722222222222 | 0 |
| 0.9541666666666666 | 0 |
| 0.9548611111111112 | 0 |
| 0.9555555555555556 | 0 |
| 0.9562499999999999 | 0 |
| 0.9569444444444444 | 0 |
| 0.9576388888888889 | 0 |
| 0.9583333333333334 | 0 |
| 0.9590277777777777 | 0 |
| 0.9597222222222223 | 0 |
| 0.9604166666666667 | 0 |
| 0.9611111111111111 | 0 |
| 0.9618055555555555 | 0 |
| 0.9625 | 0 |
| 0.9631944444444445 | 0 |
| 0.9638888888888889 | 0 |
| 0.9645833333333332 | 0 |
| 0.9652777777777778 | 0 |
| 0.9659722222222222 | 0 |
| 0.9666666666666667 | 0 |
| 0.967361111111111 | 0 |
| 0.9680555555555556 | 0 |
| 0.96875 | 0 |
| 0.9694444444444444 | 0 |
| 0.970138888888889 | 0 |
| 0.9708333333333333 | 0 |
| 0.9715277777777778 | 0 |
| 0.9722222222222222 | 0 |
| 0.9729166666666668 | 0 |
| 0.9736111111111111 | 0 |
| 0.9743055555555555 | 0 |
| 0.975 | 0 |
| 0.9756944444444445 | 0 |
| 0.9763888888888889 | 0 |
| 0.9770833333333333 | 0 |
| 0.9777777777777777 | 0 |
| 0.9784722222222223 | 0 |
| 0.9791666666666666 | 0 |
| 0.9798611111111111 | 0 |
| 0.9805555555555556 | 0 |
| 0.9812500000000001 | 0 |
| 0.9819444444444444 | 0 |
| 0.9826388888888888 | 0 |
| 0.9833333333333334 | 0 |
| 0.9840277777777778 | 0 |
| 0.9847222222222222 | 0 |
| 0.9854166666666666 | 0 |
| 0.9861111111111112 | 0 |
| 0.9868055555555556 | 0 |
| 0.9874999999999999 | 0 |
| 0.9881944444444444 | 0 |
| 0.9888888888888889 | 0 |
| 0.9895833333333334 | 0 |
| 0.9902777777777777 | 0 |
| 0.9909722222222223 | 0 |
| 0.9916666666666667 | 0 |
| 0.9923611111111111 | 0 |
| 0.9930555555555555 | 0 |
| 0.99375 | 0 |
| 0.9944444444444445 | 0 |
| 0.9951388888888889 | 0 |
| 0.9958333333333332 | 0 |
| 0.9965277777777778 | 0 |
| 0.9972222222222222 | 0 |
| 0.9979166666666667 | 0 |
| 0.998611111111111 | 0 |
| 0.9993055555555556 | 0 |